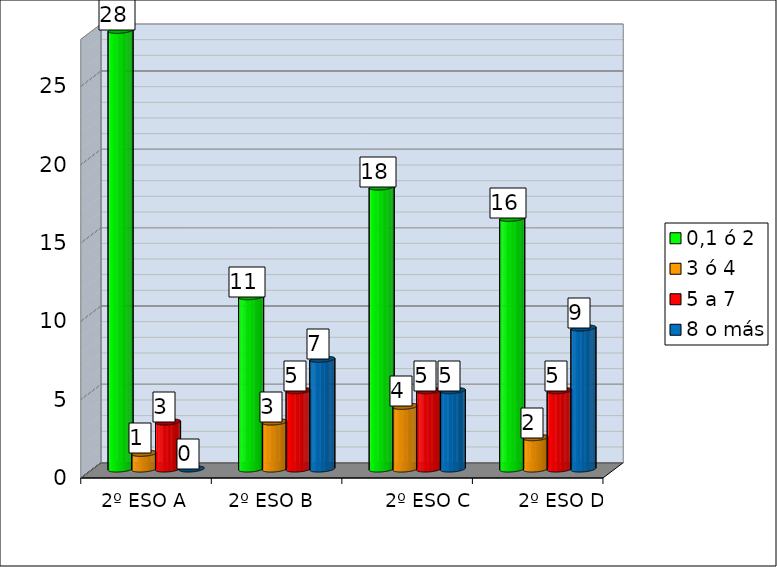
| Category | 0,1 ó 2  | 3 ó 4 | 5 a 7 | 8 o más |
|---|---|---|---|---|
|  | 28 | 1 | 3 | 0 |
|  | 11 | 3 | 5 | 7 |
|  | 18 | 4 | 5 | 5 |
|  | 16 | 2 | 5 | 9 |